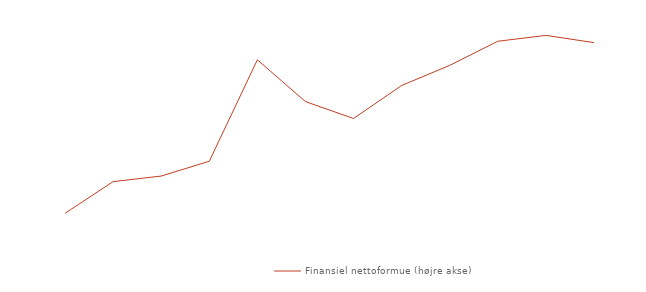
| Category | Finansiel nettoformue (højre akse) |
|---|---|
| 0 | 2650.783 |
| 1900-01-01 | 2777.501 |
| 1900-01-02 | 2799.794 |
| 1900-01-03 | 2858.994 |
| 1900-01-04 | 3264.724 |
| 1900-01-05 | 3097.58 |
| 1900-01-06 | 3029.939 |
| 1900-01-07 | 3162.028 |
| 1900-01-08 | 3242.458 |
| 1900-01-09 | 3338.96 |
| 1900-01-10 | 3362.442 |
| 1900-01-11 | 3333.515 |